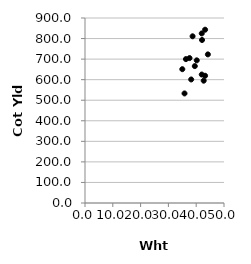
| Category | Series 0 |
|---|---|
| 38.2 | 601 |
| 37.6 | 705 |
| 35.8 | 533 |
| 36.3 | 700 |
| 39.5 | 666 |
| 43.2 | 619 |
| 42.7 | 595 |
| 42.0 | 625 |
| 40.2 | 694 |
| 35.0 | 651 |
| 44.2 | 723 |
| 43.2 | 843 |
| 42.0 | 825 |
| 38.7 | 811 |
| 42.1 | 793 |